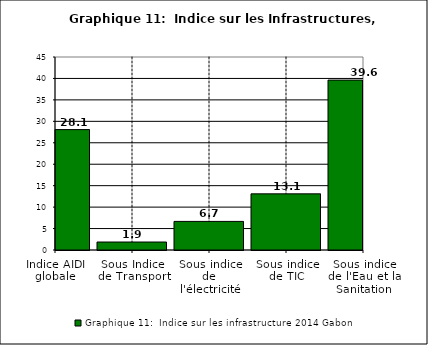
| Category | Graphique 11:  Indice sur les infrastructure 2014 |
|---|---|
| Indice AIDI globale | 28.076 |
| Sous Indice de Transport | 1.859 |
| Sous indice de l'électricité | 6.667 |
| Sous indice de TIC | 13.092 |
| Sous indice de l'Eau et la Sanitation | 39.617 |